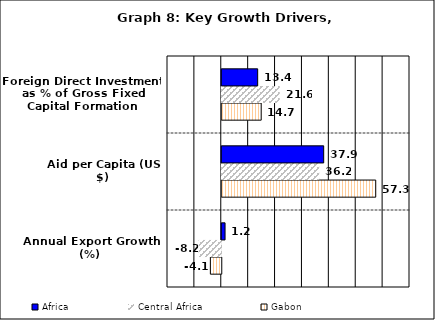
| Category | Gabon | Central Africa | Africa |
|---|---|---|---|
| Annual Export Growth (%) | -4.059 | -8.24 | 1.219 |
| Aid per Capita (US $) | 57.254 | 36.237 | 37.904 |
| Foreign Direct Investment as % of Gross Fixed Capital Formation | 14.657 | 21.581 | 13.354 |